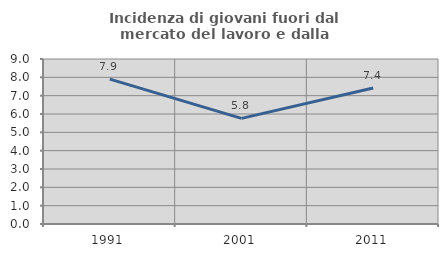
| Category | Incidenza di giovani fuori dal mercato del lavoro e dalla formazione  |
|---|---|
| 1991.0 | 7.904 |
| 2001.0 | 5.761 |
| 2011.0 | 7.416 |